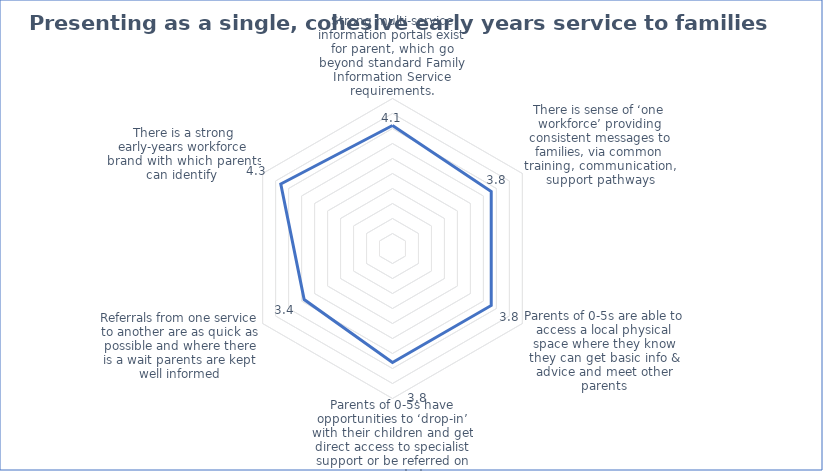
| Category | Series 0 |
|---|---|
| Strong multi-service information portals exist for parent, which go beyond standard Family Information Service requirements. | 4.1 |
| There is sense of ‘one workforce’ providing consistent messages to families, via common training, communication, support pathways | 3.8 |
| Parents of 0-5s are able to access a local physical space where they know they can get basic info & advice and meet other parents | 3.8 |
| Parents of 0-5s have opportunities to ‘drop-in’ with their children and get direct access to specialist support or be referred on as needed | 3.8 |
| Referrals from one service to another are as quick as possible and where there is a wait parents are kept well informed | 3.4 |
| There is a strong early-years workforce brand with which parents can identify  | 4.3 |